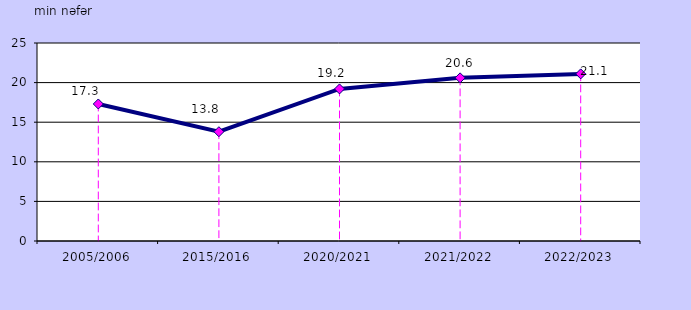
| Category | Series 0 |
|---|---|
| 2005/2006 | 17.3 |
| 2015/2016 | 13.8 |
| 2020/2021 | 19.2 |
| 2021/2022 | 20.6 |
| 2022/2023 | 21.1 |